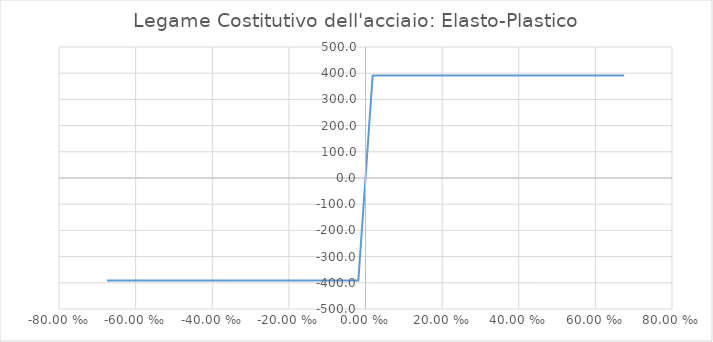
| Category | Series 0 |
|---|---|
| -67.5 | -391.304 |
| -1.87 | -391.304 |
| 0.0 | 0 |
| 1.87 | 391.304 |
| 67.5 | 391.304 |